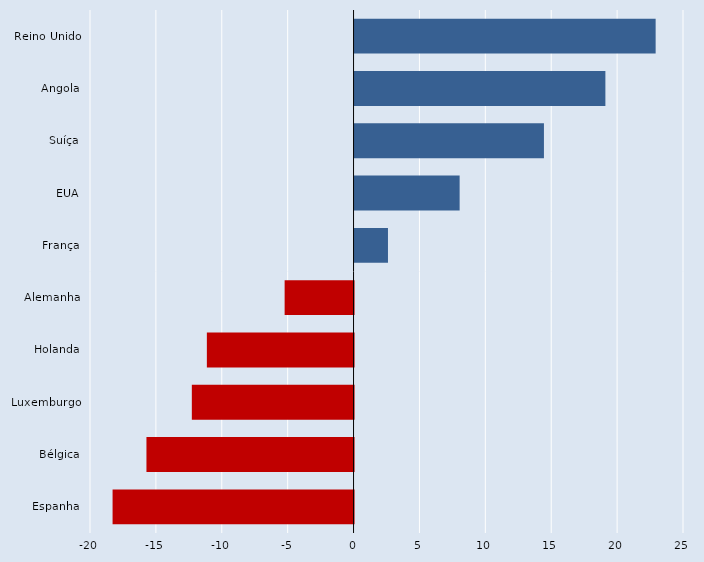
| Category | Series 0 |
|---|---|
| Reino Unido | 22.848 |
| Angola | 19.034 |
| Suíça | 14.372 |
| EUA | 7.974 |
| França | 2.536 |
| Alemanha | -5.23 |
| Holanda | -11.132 |
| Luxemburgo | -12.273 |
| Bélgica | -15.716 |
| Espanha | -18.287 |